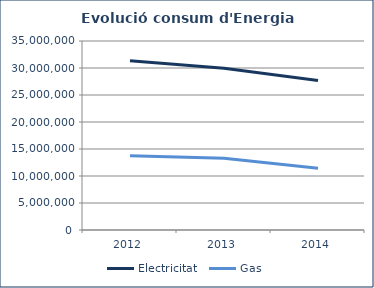
| Category | Electricitat  | Gas |
|---|---|---|
| 2012.0 | 31354841 | 13753576 |
| 2013.0 | 29958213.969 | 13282642 |
| 2014.0 | 27682421.658 | 11441025 |